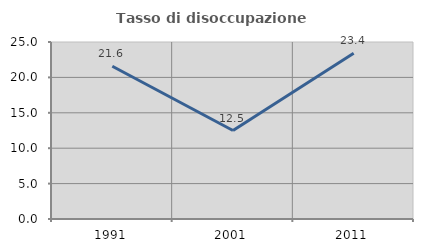
| Category | Tasso di disoccupazione giovanile  |
|---|---|
| 1991.0 | 21.569 |
| 2001.0 | 12.5 |
| 2011.0 | 23.404 |